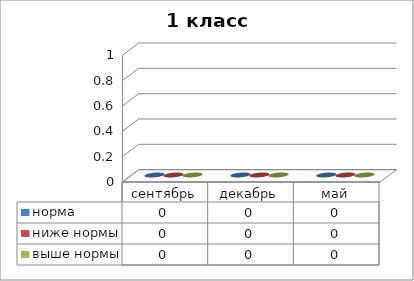
| Category | норма | ниже нормы | выше нормы |
|---|---|---|---|
| сентябрь | 0 | 0 | 0 |
| декабрь | 0 | 0 | 0 |
| май | 0 | 0 | 0 |